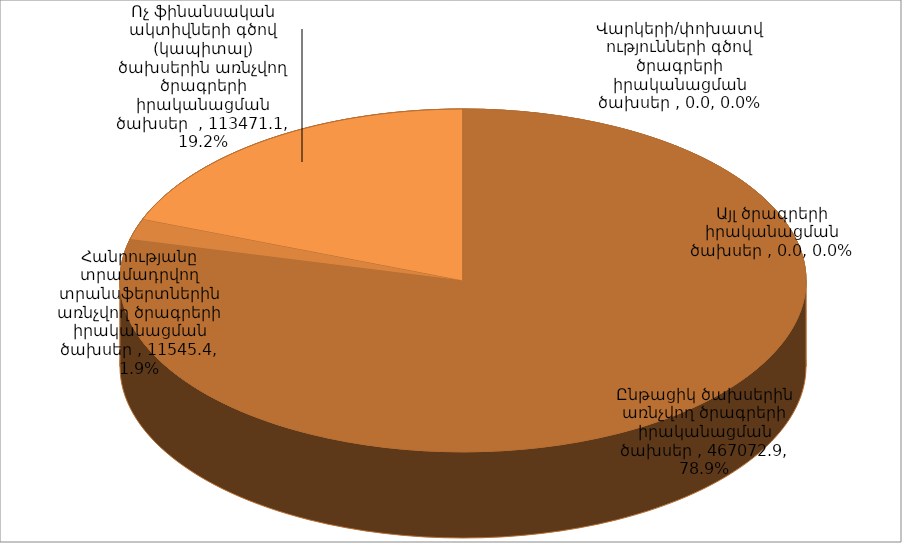
| Category | Series 0 |
|---|---|
| Ընթացիկ ծախսերին առնչվող ծրագրերի իրականացման ծախսեր  | 467072.9 |
| Հանրությանը տրամադրվող տրանսֆերտներին առնչվող ծրագրերի իրականացման ծախսեր  | 11545.4 |
| Ոչ ֆինանսական ակտիվների գծով (կապիտալ) ծախսերին առնչվող ծրագրերի իրականացման ծախսեր   | 113471.05 |
| Վարկերի/փոխատվությունների գծով ծրագրերի իրականացման ծախսեր  | 0 |
| Այլ ծրագրերի իրականացման ծախսեր  | 0 |